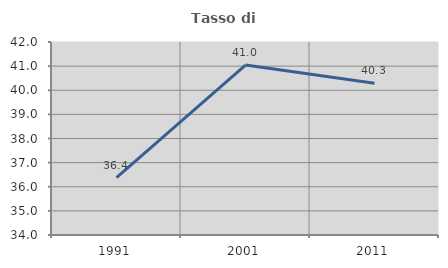
| Category | Tasso di occupazione   |
|---|---|
| 1991.0 | 36.374 |
| 2001.0 | 41.044 |
| 2011.0 | 40.287 |